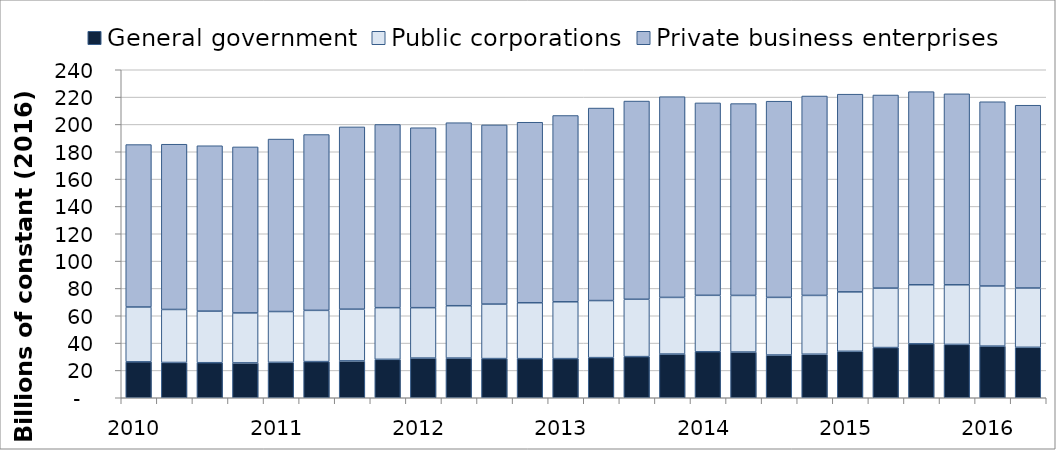
| Category | General government | Public corporations | Private business enterprises |
|---|---|---|---|
| 2010.0 | 26.275 | 40.132 | 118.846 |
| nan | 25.824 | 38.774 | 120.911 |
| nan | 25.642 | 37.746 | 121.013 |
| nan | 25.508 | 36.572 | 121.455 |
| 2011.0 | 25.908 | 37.18 | 126.193 |
| nan | 26.453 | 37.5 | 128.639 |
| nan | 26.973 | 37.834 | 133.372 |
| nan | 28.105 | 37.823 | 134.03 |
| 2012.0 | 29.02 | 36.898 | 131.66 |
| nan | 29.019 | 38.332 | 133.907 |
| nan | 28.657 | 39.886 | 131.096 |
| nan | 28.612 | 40.905 | 132.071 |
| 2013.0 | 28.635 | 41.596 | 136.295 |
| nan | 29.357 | 41.766 | 140.848 |
| nan | 30.101 | 41.97 | 145.017 |
| nan | 31.976 | 41.455 | 146.851 |
| 2014.0 | 33.669 | 41.296 | 140.778 |
| nan | 33.445 | 41.438 | 140.365 |
| nan | 31.279 | 42.166 | 143.545 |
| nan | 31.864 | 43.028 | 145.895 |
| 2015.0 | 33.989 | 43.494 | 144.645 |
| nan | 36.723 | 43.51 | 141.291 |
| nan | 39.477 | 43.196 | 141.3 |
| nan | 39.035 | 43.632 | 139.718 |
| 2016.0 | 37.78 | 44.004 | 134.805 |
| nan | 36.913 | 43.393 | 133.74 |